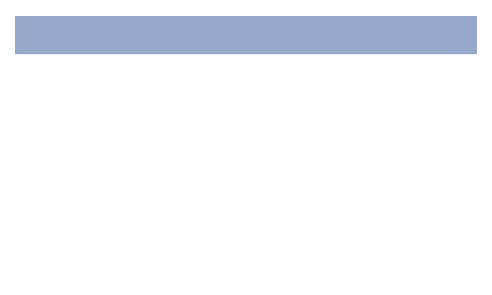
| Category | Series 0 | Series 1 | Series 2 |
|---|---|---|---|
| 0.0 | 0 | 1200 | 6900 |
| 10.0 | 0 | 1200 | 6900 |
| 90.0 | 0 | 1200 | 6900 |
| 100.0 | 0 | 1200 | 6900 |